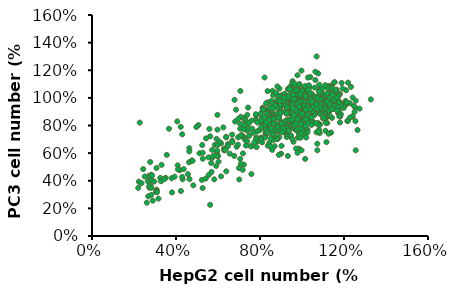
| Category | PC3 |
|---|---|
| 0.9039794408535161 | 0.946 |
| 0.8946343742699167 | 0.918 |
| 0.9824780001557512 | 0.901 |
| 0.9401136983101005 | 0.904 |
| 0.5625730083326844 | 0.722 |
| 0.9581808270383927 | 0.885 |
| 0.8634841523245853 | 0.888 |
| 0.835448952573787 | 0.912 |
| 0.8535160813020792 | 0.978 |
| 0.8123977883342419 | 0.929 |
| 0.9905770578615373 | 0.923 |
| 0.9961840978116969 | 0.904 |
| 0.9631648625496456 | 0.909 |
| 1.0049061599563898 | 0.913 |
| 1.0136282221010824 | 0.896 |
| 0.9301456272875944 | 0.925 |
| 0.920800560703995 | 0.94 |
| 0.9183085429483685 | 0.975 |
| 0.9457207382602602 | 0.93 |
| 0.9232925784596215 | 0.901 |
| 0.9550658048438595 | 0.901 |
| 0.9345066583599408 | 0.891 |
| 0.854139085740986 | 0.905 |
| 0.9251615917763414 | 0.951 |
| 0.9706409158165252 | 1.059 |
| 0.9999221244451366 | 1.015 |
| 1.017989253173429 | 0.996 |
| 1.0615995638968927 | 0.992 |
| 0.9787399735223113 | 0.908 |
| 0.9799859824001246 | 0.961 |
| 0.9519507826493264 | 0.933 |
| 0.9494587648936998 | 0.985 |
| 1.087765750330971 | 0.997 |
| 0.952573787088233 | 0.98 |
| 0.9787399735223113 | 0.955 |
| 0.9295226228486878 | 0.964 |
| 0.7432442956156062 | 0.93 |
| 0.9494587648936998 | 0.908 |
| 0.9002414142200763 | 0.904 |
| 0.89401136983101 | 0.956 |
| 0.9656568803052722 | 1.059 |
| 0.984347013472471 | 1 |
| 0.9544428004049529 | 1.031 |
| 0.5625730083326844 | 0.225 |
| 0.964410871427459 | 0.974 |
| 0.967525893621992 | 0.973 |
| 0.9718869246943385 | 0.964 |
| 1.0435324351686006 | 0.991 |
| 0.952573787088233 | 1.094 |
| 0.9706409158165252 | 0.999 |
| 1.05474651506892 | 0.985 |
| 0.9650338758663656 | 0.94 |
| 0.9880850401059108 | 0.964 |
| 0.9338836539210342 | 0.939 |
| 1.0005451288840432 | 0.956 |
| 0.9656568803052722 | 1.001 |
| 1.0005451288840432 | 1.06 |
| 0.8136437972120552 | 0.918 |
| 1.0348103730239078 | 0.932 |
| 0.9806089868390312 | 1.027 |
| 0.9612958492329258 | 0.927 |
| 0.9151935207538354 | 0.986 |
| 0.9831010045946578 | 1.005 |
| 0.9936920800560703 | 1.038 |
| 0.9974301066895102 | 1.039 |
| 1.006152168834203 | 0.929 |
| 0.9232925784596215 | 0.903 |
| 0.8915193520753836 | 0.85 |
| 0.9669028891830854 | 0.888 |
| 0.9905770578615373 | 0.942 |
| 0.8391869792072268 | 0.896 |
| 0.9799859824001246 | 0.974 |
| 0.9961840978116969 | 0.996 |
| 1.0921267814033175 | 0.938 |
| 0.8366949614516004 | 0.967 |
| 0.6815668561638502 | 0.829 |
| 0.9774939646444981 | 0.846 |
| 0.9812319912779378 | 0.877 |
| 1.006152168834203 | 0.965 |
| 1.0098901954676427 | 1.001 |
| 1.2079282918823382 | 0.978 |
| 1.1756091402600681 | 0.944 |
| 1.117030677944704 | 0.873 |
| 1.0493624542355764 | 0.813 |
| 0.9261456886756723 | 0.804 |
| 0.9897740184320162 | 0.954 |
| 1.0029036737785633 | 0.827 |
| 1.0655220300467112 | 0.929 |
| 1.1291503598030552 | 0.908 |
| 1.0443125867945966 | 0.936 |
| 0.9261456886756723 | 0.831 |
| 1.0332028784244414 | 0.859 |
| 0.9524049993687665 | 0.811 |
| 1.0362327988890292 | 0.859 |
| 1.0806716323696504 | 0.898 |
| 1.0604721626057316 | 0.982 |
| 1.0796616588814543 | 0.925 |
| 0.990783991920212 | 0.904 |
| 1.0140133821487185 | 0.846 |
| 0.991793965408408 | 0.748 |
| 0.36662037621512433 | 0.776 |
| 0.22724403484408534 | 0.821 |
| 0.977654336573665 | 0.927 |
| 0.9877540714556243 | 0.982 |
| 1.0907713672516097 | 1.001 |
| 1.0039136472667594 | 0.915 |
| 0.9857341244792324 | 0.892 |
| 0.9231157682110844 | 0.802 |
| 0.8049488700921601 | 0.837 |
| 0.8938265370534023 | 0.925 |
| 0.8918065900770105 | 0.93 |
| 0.9897740184320162 | 1.05 |
| 1.0220931700542861 | 1.002 |
| 1.023103143542482 | 0.932 |
| 1.038252745865421 | 0.857 |
| 0.8736270672894837 | 0.857 |
| 0.8928165635652064 | 0.946 |
| 0.9019063249589698 | 0.818 |
| 0.9564448933215504 | 0.89 |
| 0.9857341244792324 | 0.86 |
| 0.9705845221562934 | 0.846 |
| 1.007953541219543 | 0.895 |
| 1.0099734881959348 | 0.854 |
| 1.0261330640070698 | 0.769 |
| 0.9665446282035096 | 0.773 |
| 0.883726802171443 | 0.754 |
| 0.8776669612422674 | 0.813 |
| 0.9332155030930438 | 0.838 |
| 0.898876404494382 | 0.963 |
| 0.8726170938012877 | 0.867 |
| 0.9998737533139755 | 0.818 |
| 0.7140512561545259 | 0.729 |
| 0.7393005933594243 | 0.877 |
| 0.7817194798636535 | 0.873 |
| 0.4060093422547658 | 0.83 |
| 1.0029036737785633 | 0.816 |
| 0.9372553970458275 | 0.937 |
| 0.9574548668097462 | 0.839 |
| 0.9291756091402601 | 0.749 |
| 0.8978664310061861 | 0.796 |
| 0.7241509910364853 | 0.854 |
| 0.7090013887135462 | 0.863 |
| 0.7776795859108698 | 0.842 |
| 0.8140386314859235 | 0.919 |
| 0.6787021840676682 | 0.986 |
| 1.0463325337709886 | 0.836 |
| 0.9271556621638682 | 0.716 |
| 1.0261330640070698 | 0.751 |
| 0.7978790556747886 | 0.765 |
| 0.8796869082186592 | 0.882 |
| 0.8968564575179901 | 0.949 |
| 0.9968438328493877 | 0.94 |
| 1.0200732230778942 | 0.853 |
| 0.9897740184320162 | 0.867 |
| 1.0180532761015024 | 0.784 |
| 1.0513824012119681 | 0.961 |
| 0.8594874384547405 | 1.051 |
| 0.9322055296048479 | 1.064 |
| 0.9251357151874763 | 0.966 |
| 0.9049362454235577 | 1.02 |
| 1.1807157645666961 | 0.822 |
| 1.1594202898550725 | 0.967 |
| 1.2162082224194026 | 0.833 |
| 1.1428571428571428 | 0.855 |
| 1.2185743862762497 | 0.833 |
| 1.2079266489204377 | 0.954 |
| 1.162969535640343 | 0.978 |
| 1.05175983436853 | 1.02 |
| 0.9653948535936113 | 0.95 |
| 1.0588583259390714 | 0.942 |
| 1.1144631765749777 | 0.884 |
| 1.1724341910677314 | 0.89 |
| 1.1511387163561078 | 0.964 |
| 1.2398698609878733 | 0.863 |
| 1.132209405501331 | 0.906 |
| 1.274179236912156 | 0.922 |
| 1.1227447500739427 | 0.985 |
| 0.9997042295178941 | 0.782 |
| 1.2079266489204377 | 0.95 |
| 1.18189884649512 | 0.865 |
| 1.1854480922803905 | 0.881 |
| 1.1416740609287193 | 0.978 |
| 1.2410529429162969 | 1.002 |
| 1.2114758947057083 | 0.967 |
| 1.0482105885832593 | 1.026 |
| 1.1144631765749777 | 0.972 |
| 1.129843241644484 | 0.996 |
| 1.1156462585034013 | 0.998 |
| 1.1333924874297545 | 1.023 |
| 1.228039041703638 | 0.961 |
| 1.2102928127772847 | 1.055 |
| 1.1404909790002957 | 1.089 |
| 1.0434782608695652 | 0.863 |
| 1.062407571724342 | 0.945 |
| 1.090801538006507 | 0.945 |
| 1.0434782608695652 | 0.948 |
| 1.054125998225377 | 0.996 |
| 1.0659568175096126 | 0.918 |
| 1.1724341910677314 | 1.01 |
| 1.1807157645666961 | 1.028 |
| 0.9677610174504584 | 0.938 |
| 1.0919846199349306 | 0.999 |
| 1.093167701863354 | 0.983 |
| 1.0553090801538008 | 0.959 |
| 1.064773735581189 | 0.932 |
| 1.1286601597160604 | 1.086 |
| 1.10854776693286 | 0.98 |
| 1.132209405501331 | 1.038 |
| 1.0422951789411417 | 0.911 |
| 1.0919846199349306 | 0.913 |
| 1.093167701863354 | 0.94 |
| 1.0553090801538008 | 0.905 |
| 1.064773735581189 | 0.926 |
| 1.1286601597160604 | 0.908 |
| 1.10854776693286 | 0.951 |
| 1.132209405501331 | 0.871 |
| 1.0280981958000592 | 0.994 |
| 1.0221827861579413 | 1.05 |
| 1.0860692102928127 | 1.044 |
| 1.0162673765158237 | 0.972 |
| 1.1535048802129548 | 1.02 |
| 1.0150842945874001 | 1.086 |
| 1.1771665187814255 | 1.03 |
| 1.0695060632948832 | 1.3 |
| 0.9523809523809523 | 1.087 |
| 0.9381839692398699 | 0.998 |
| 1.0493936705116829 | 0.93 |
| 0.9204377403135167 | 0.898 |
| 0.9985211475894705 | 1.023 |
| 1.0446613427979887 | 1.006 |
| 1.0328305235137534 | 0.983 |
| 1.0020703933747412 | 1.054 |
| 0.8624667258207631 | 1.018 |
| 0.9026915113871635 | 0.975 |
| 1.0056196391600118 | 0.924 |
| 0.9204377403135167 | 0.986 |
| 0.8080449571132801 | 0.82 |
| 0.8967761017450459 | 1.015 |
| 0.9168884945282461 | 1.03 |
| 0.9582963620230701 | 1.063 |
| 1.1316025067144135 | 1.028 |
| 1.1683079677708146 | 0.906 |
| 0.9659803043867502 | 0.943 |
| 1.1199641897940913 | 0.818 |
| 1.1190689346463742 | 0.861 |
| 0.9865711727842436 | 1.014 |
| 1.1056401074306177 | 1.021 |
| 1.0564010743061774 | 0.951 |
| 0.9883616830796778 | 1.097 |
| 0.8845120859444942 | 1.019 |
| 1.0590868397493285 | 0.875 |
| 1.1772605192479857 | 0.867 |
| 1.0662488809310653 | 0.935 |
| 1.188898836168308 | 1.108 |
| 1.2193375111906894 | 1.11 |
| 1.153088630259624 | 1.11 |
| 1.091316025067144 | 1.043 |
| 1.098478066248881 | 1.01 |
| 1.1181736794986572 | 1.084 |
| 1.054610564010743 | 0.98 |
| 0.954341987466428 | 0.968 |
| 1.0295434198746642 | 0.977 |
| 1.0957923008057295 | 0.964 |
| 1.0823634735899732 | 1.096 |
| 1.0948970456580125 | 1.018 |
| 1.1208594449418083 | 0.951 |
| 1.0769919427036705 | 1.177 |
| 1.107430617726052 | 0.929 |
| 1.1772605192479857 | 0.975 |
| 1.0841539838854073 | 1.025 |
| 1.0599820948970458 | 1.075 |
| 1.198746642793196 | 0.926 |
| 0.9534467323187108 | 1.049 |
| 0.9435989256938228 | 1.023 |
| 1.035810205908684 | 1.076 |
| 1.1280214861235451 | 0.971 |
| 1.08952551477171 | 1.048 |
| 1.0832587287376902 | 0.915 |
| 1.3276633840644583 | 0.989 |
| 1.1119068934646374 | 0.924 |
| 0.7000895255147717 | 0.492 |
| 0.964189794091316 | 0.93 |
| 0.9785138764547896 | 1.164 |
| 0.9838854073410922 | 1.035 |
| 1.1101163831692031 | 0.986 |
| 1.143240823634736 | 1.038 |
| 1.0635631154879142 | 1.189 |
| 1.037600716204118 | 0.966 |
| 0.981199641897941 | 0.929 |
| 1.0787824529991048 | 0.963 |
| 0.955237242614145 | 1.121 |
| 1.0313339301700986 | 1.023 |
| 1.099373321396598 | 0.944 |
| 0.9776186213070726 | 1.051 |
| 1.1933751119068934 | 1.068 |
| 0.9650850492390332 | 0.959 |
| 0.9077887197851388 | 0.776 |
| 0.8683974932855864 | 0.955 |
| 0.9534467323187108 | 0.993 |
| 1.0689346463742166 | 0.75 |
| 0.42256042972247093 | 0.79 |
| 0.9704565801253358 | 0.986 |
| 1.0975828111011638 | 1.028 |
| 0.9507609668755596 | 0.884 |
| 0.9382273948075202 | 0.934 |
| 0.9534467323187108 | 0.939 |
| 0.927484333034915 | 1.012 |
| 0.9570277529095792 | 0.936 |
| 0.9829901521933752 | 1.09 |
| 0.982094897045658 | 1.039 |
| 1.0635631154879142 | 1.129 |
| 0.9973142345568488 | 1.197 |
| 0.9489704565801254 | 0.835 |
| 0.8925693822739481 | 1.067 |
| 0.8889883616830797 | 0.981 |
| 0.9140555058191585 | 1.003 |
| 0.8809310653536258 | 0.985 |
| 0.88272157564906 | 1.083 |
| 0.9319606087735004 | 1.008 |
| 0.9606087735004476 | 1.021 |
| 1.0196207749381698 | 0.876 |
| 1.2530915086562242 | 0.93 |
| 1.1686727122835945 | 0.945 |
| 1.0842539159109645 | 0.745 |
| 1.085572959604287 | 0.808 |
| 1.0499587798845837 | 0.97 |
| 1.085572959604287 | 0.939 |
| 1.2412201154163232 | 0.867 |
| 1.1845012366034624 | 0.939 |
| 1.133058532563891 | 1.002 |
| 0.9193734542456719 | 0.762 |
| 1.1000824402308327 | 0.851 |
| 1.1119538334707337 | 0.866 |
| 1.0618301731244848 | 0.935 |
| 0.3073371805441055 | 0.336 |
| 1.113272877164056 | 1.017 |
| 1.0394064303380048 | 0.98 |
| 1.0328112118713932 | 0.964 |
| 1.0697444352844188 | 0.96 |
| 1.0921681780708985 | 0.91 |
| 0.8916735366859028 | 0.917 |
| 0.8468260511129431 | 0.918 |
| 1.047320692497939 | 0.986 |
| 1.0908491343775764 | 0.995 |
| 1.2333058532563892 | 1.08 |
| 0.35614179719703215 | 0.587 |
| 1.1198680956306677 | 0.967 |
| 1.1502061005770816 | 0.92 |
| 1.1502061005770816 | 1.027 |
| 1.0921681780708985 | 1.04 |
| 1.0842539159109645 | 0.891 |
| 1.247815333882935 | 0.941 |
| 1.1647155812036274 | 1.06 |
| 0.9906018136850783 | 0.928 |
| 1.1462489694971145 | 1.023 |
| 1.0763396537510306 | 0.818 |
| 1.1040395713107998 | 0.853 |
| 0.9444352844187964 | 0.933 |
| 1.109315746084089 | 0.885 |
| 1.2504534212695795 | 0.899 |
| 1.0394064303380048 | 1.151 |
| 0.9417971970321517 | 1.078 |
| 1.1765869744435284 | 0.901 |
| 1.105358615004122 | 0.87 |
| 1.1383347073371806 | 1.072 |
| 1.005111294311624 | 0.788 |
| 0.8441879637262985 | 0.928 |
| 1.255729596042869 | 0.98 |
| 1.0816158285243198 | 1.06 |
| 0.9866446826051113 | 1.032 |
| 1.133058532563891 | 0.937 |
| 0.9774113767518549 | 0.815 |
| 1.1079967023907666 | 0.953 |
| 1.085572959604287 | 0.885 |
| 1.1119538334707337 | 0.762 |
| 1.055234954657873 | 0.823 |
| 1.0328112118713932 | 1.091 |
| 1.005111294311624 | 1.044 |
| 1.1462489694971145 | 1.067 |
| 1.1145919208573785 | 0.982 |
| 1.0618301731244848 | 0.915 |
| 1.0750206100577082 | 0.908 |
| 1.0987633965375103 | 0.873 |
| 1.1277823577906019 | 0.908 |
| 0.8362737015663644 | 1.049 |
| 1.0367683429513603 | 1.039 |
| 1.1607584501236603 | 1.057 |
| 1.1106347897774114 | 0.979 |
| 1.1356966199505358 | 0.963 |
| 0.9840065952184666 | 0.936 |
| 1.213520197856554 | 0.968 |
| 0.9866446826051113 | 1.099 |
| 0.9774113767518549 | 0.898 |
| 0.9906018136850783 | 0.972 |
| 0.9747732893652102 | 1.056 |
| 1.0103874690849135 | 0.943 |
| 1.1198680956306677 | 1.072 |
| 1.0130255564715582 | 1.013 |
| 1.089530090684254 | 0.954 |
| 0.8217642209398186 | 1.148 |
| 0.5692108667529108 | 0.464 |
| 0.3081788127066264 | 0.328 |
| 0.2230846629294236 | 0.393 |
| 1.0728762397585165 | 0.621 |
| 0.9854822480954435 | 0.632 |
| 1.0728762397585165 | 0.668 |
| 0.9716831967802214 | 0.633 |
| 1.061377030329165 | 1.007 |
| 0.5703607876958459 | 0.564 |
| 0.265631737818025 | 0.397 |
| 0.7233002731062239 | 0.516 |
| 0.9325858847204255 | 0.579 |
| 1.1165732355900533 | 0.68 |
| 0.9785827224378324 | 0.757 |
| 1.254563748742274 | 0.831 |
| 1.1384217335058215 | 0.749 |
| 0.2702314215897657 | 0.434 |
| 0.6359062814431508 | 0.635 |
| 1.002731062239471 | 0.758 |
| 0.9797326433807676 | 0.712 |
| 1.1269225240764698 | 0.74 |
| 0.9475348569785828 | 0.728 |
| 0.969383354894351 | 0.772 |
| 1.015380192611758 | 0.73 |
| 1.0774759235302573 | 1.015 |
| 0.9003880983182406 | 0.596 |
| 0.6025585740980307 | 0.538 |
| 0.2794307891332471 | 0.365 |
| 0.9785827224378324 | 0.603 |
| 0.8451918930573523 | 0.677 |
| 0.2736811844185712 | 0.349 |
| 0.8256432370274543 | 0.749 |
| 0.7244501940491591 | 0.714 |
| 0.9716831967802214 | 0.806 |
| 0.25068276555986774 | 0.43 |
| 0.9854822480954435 | 0.727 |
| 0.7175506683915481 | 0.479 |
| 1.0199798763834986 | 0.713 |
| 0.6255569929567342 | 0.786 |
| 1.2557136696852091 | 0.621 |
| 0.3311772315653299 | 0.515 |
| 0.9831824062095731 | 0.772 |
| 0.9590340664079344 | 0.931 |
| 0.7589478223372144 | 0.448 |
| 1.082075607301998 | 0.802 |
| 1.141871496334627 | 0.919 |
| 1.0809256863590628 | 0.768 |
| 1.0567773465574242 | 0.892 |
| 0.7278999568779646 | 0.836 |
| 0.8923386517176944 | 0.717 |
| 0.9383354894351014 | 0.764 |
| 0.27713094724737675 | 0.536 |
| 0.737099324421446 | 0.807 |
| 0.8612907862584447 | 0.836 |
| 0.9590340664079344 | 0.836 |
| 1.0211297973264337 | 0.848 |
| 0.9544343826361937 | 1.109 |
| 1.108523788989507 | 0.848 |
| 1.0786258444731924 | 0.757 |
| 0.9935316946959897 | 0.712 |
| 0.28173063101911744 | 0.443 |
| 0.28633031479085813 | 0.438 |
| 0.41857122322840307 | 0.477 |
| 1.0165301135546931 | 0.798 |
| 1.0199798763834986 | 1.016 |
| 0.9509846198073882 | 0.827 |
| 1.1062239471036366 | 0.924 |
| 0.9130372286905275 | 0.79 |
| 0.9486847779215178 | 0.838 |
| 0.677303435388817 | 0.579 |
| 0.9268362800057496 | 0.836 |
| 1.1142733937041829 | 0.974 |
| 0.24378323990225673 | 0.484 |
| 0.8371424464568061 | 0.654 |
| 0.8474917349432226 | 0.78 |
| 0.9509846198073882 | 0.859 |
| 0.9808825643237028 | 0.916 |
| 0.9268362800057496 | 0.758 |
| 1.0441282161851373 | 0.824 |
| 1.1832686502802932 | 0.964 |
| 0.7289386612369559 | 0.696 |
| 0.8307457368287096 | 0.798 |
| 0.9244082463731229 | 0.739 |
| 0.48256553830491217 | 0.367 |
| 1.0302876049885468 | 0.823 |
| 0.9753117841689998 | 0.772 |
| 0.9488419445151438 | 0.806 |
| 0.9223721048612878 | 0.947 |
| 0.8897938406719267 | 0.587 |
| 0.6393484347162128 | 0.468 |
| 0.8307457368287096 | 0.846 |
| 0.9936370577755154 | 0.778 |
| 0.7900229065920081 | 0.691 |
| 0.8063120386866888 | 0.714 |
| 0.46220412318656146 | 0.534 |
| 0.8816492746245864 | 0.926 |
| 0.8673962840417409 | 0.72 |
| 0.7187579536777806 | 0.598 |
| 0.9732756426571647 | 0.88 |
| 0.9325528124204632 | 0.767 |
| 0.9977093407991855 | 0.62 |
| 0.4235174344616951 | 0.325 |
| 1.1565283787223213 | 0.942 |
| 0.9773479256808348 | 0.955 |
| 0.8592517179944006 | 0.734 |
| 1.0038177653346907 | 0.822 |
| 1.0282514634767117 | 0.91 |
| 0.8836854161364215 | 0.703 |
| 0.9936370577755154 | 0.743 |
| 1.1137694069737847 | 0.819 |
| 1.1341308220921353 | 0.952 |
| 0.506999236446933 | 0.803 |
| 1.26444387884958 | 0.767 |
| 1.2277933316365488 | 0.858 |
| 1.1035886994146094 | 0.855 |
| 0.8959022652074319 | 0.768 |
| 0.9977093407991855 | 0.83 |
| 0.9060829727666073 | 0.823 |
| 1.0058539068465258 | 0.911 |
| 0.8755408500890812 | 1.037 |
| 0.8185288877576992 | 0.815 |
| 0.8327818783405446 | 0.886 |
| 0.8429625858997201 | 0.866 |
| 0.9142275388139476 | 0.752 |
| 1.1850343598880122 | 0.94 |
| 1.093407991855434 | 0.991 |
| 1.0750827182489182 | 0.999 |
| 0.9427335199796386 | 1.062 |
| 0.6474930007635531 | 0.666 |
| 0.43166200050903536 | 0.411 |
| 0.928480529396793 | 0.93 |
| 0.4296258589972003 | 0.428 |
| 0.8612878595062357 | 0.816 |
| 1.0811911427844234 | 0.987 |
| 1.1198778315092899 | 1.033 |
| 0.9651310766098243 | 1.102 |
| 0.8633240010180707 | 0.75 |
| 0.7839144820565029 | 0.684 |
| 0.954950369050649 | 0.79 |
| 0.7879867650801731 | 0.687 |
| 0.5721557648256553 | 0.623 |
| 0.8816492746245864 | 0.703 |
| 1.089335708831764 | 0.92 |
| 1.0282514634767117 | 1.147 |
| 0.8388903028760499 | 0.818 |
| 0.6678544158819038 | 0.69 |
| 0.5232883685416136 | 0.406 |
| 1.036396029524052 | 0.906 |
| 0.5558666327309748 | 0.442 |
| 0.4642402646983965 | 0.412 |
| 0.6149147365741919 | 0.671 |
| 1.0078900483583608 | 1.031 |
| 0.7798421990328328 | 0.882 |
| 0.8327818783405446 | 0.843 |
| 0.8673962840417409 | 0.944 |
| 0.8266734538050394 | 0.768 |
| 0.8185288877576992 | 0.836 |
| 0.8327818783405446 | 0.807 |
| 0.8083481801985238 | 0.856 |
| 0.7065411046067702 | 1.05 |
| 0.4633755123863839 | 0.636 |
| 0.7057565496346462 | 0.777 |
| 0.5845660310105151 | 0.659 |
| 0.5432186775975761 | 0.707 |
| 0.6287649260381394 | 0.632 |
| 0.7841739440384958 | 0.644 |
| 0.8283728390661201 | 0.81 |
| 0.9224737123507396 | 0.835 |
| 0.554624844056318 | 0.569 |
| 0.3792550347531634 | 0.418 |
| 0.4747816788451256 | 0.547 |
| 0.85973979682766 | 0.735 |
| 0.26804491178043127 | 0.287 |
| 0.38068080556050615 | 0.316 |
| 0.35073961860630903 | 0.422 |
| 0.3250757440741401 | 0.42 |
| 0.4633755123863839 | 0.612 |
| 0.8169666726073783 | 0.794 |
| 0.7385492782035288 | 0.685 |
| 0.8283728390661201 | 0.735 |
| 0.9595437533416503 | 0.682 |
| 1.0151488148280163 | 0.558 |
| 0.2837283906612012 | 0.404 |
| 0.7299946533594724 | 0.843 |
| 0.2965603279272857 | 0.395 |
| 0.6886472999465336 | 0.646 |
| 0.2823026198538585 | 0.298 |
| 0.5275351987168063 | 0.559 |
| 0.7485296738549279 | 0.725 |
| 0.2894314738905721 | 0.256 |
| 0.5760114061664587 | 0.578 |
| 0.8711459632864017 | 0.769 |
| 0.8583140260203173 | 0.623 |
| 0.8896809837818571 | 0.765 |
| 0.7599358403136696 | 0.649 |
| 0.7556585278916415 | 0.65 |
| 0.2609160577437177 | 0.241 |
| 0.8240955266440919 | 0.712 |
| 0.5988237390839423 | 0.659 |
| 0.8925325253965425 | 0.769 |
| 0.5973979682765995 | 0.77 |
| 0.5118517198360364 | 0.599 |
| 0.600249509891285 | 0.578 |
| 0.27232222420245944 | 0.361 |
| 0.6145072179647122 | 0.432 |
| 0.8041347353412939 | 0.703 |
| 0.8198182142220638 | 0.839 |
| 0.6672607378363928 | 0.734 |
| 0.40777045090001784 | 0.512 |
| 0.31652111923008375 | 0.271 |
| 0.5916948850472287 | 0.507 |
| 0.9025129210479416 | 0.653 |
| 0.9524148993049367 | 0.705 |
| 0.8098378185706647 | 0.677 |
| 0.7328461949741579 | 0.655 |
| 0.69720192479059 | 0.849 |
| 0.6472999465335947 | 0.65 |
| 0.869720192479059 | 0.65 |
| 0.8640171092496881 | 0.696 |
| 0.4790589912671538 | 0.544 |
| 0.85973979682766 | 0.814 |
| 0.941008732846195 | 0.836 |
| 0.8625913384423454 | 0.814 |
| 0.5589021564783461 | 0.776 |
| 0.9367314204241668 | 0.889 |
| 0.7128854036713598 | 0.72 |
| 0.7827481732311531 | 0.715 |
| 0.6957761539832472 | 0.715 |
| 0.5945464266619142 | 0.603 |
| 0.655854571377651 | 0.596 |
| 0.6073783639279986 | 0.682 |
| 0.6387453216895385 | 0.718 |
| 0.9880591694885047 | 0.931 |
| 0.8055605061486366 | 0.834 |
| 0.7014792372126181 | 0.409 |
| 0.9267510247727678 | 0.781 |
| 0.8511851719836037 | 0.707 |
| 0.40919622170736053 | 0.482 |
| 0.305114952771342 | 0.319 |
| 0.6686865086437355 | 0.679 |
| 0.9606003752345216 | 0.975 |
| 0.8585365853658536 | 0.958 |
| 0.6859287054409006 | 0.914 |
| 0.8285178236397749 | 0.961 |
| 0.8210131332082552 | 0.859 |
| 0.49681050656660414 | 0.789 |
| 0.9711069418386492 | 0.892 |
| 0.8420262664165103 | 0.844 |
| 0.5928705440900562 | 0.581 |
| 0.7804878048780488 | 0.699 |
| 0.8915572232645403 | 0.871 |
| 0.9545966228893058 | 0.953 |
| 0.8945590994371482 | 0.793 |
| 1.1121951219512196 | 0.965 |
| 1.1722326454033771 | 1.017 |
| 0.9095684803001877 | 0.979 |
| 1.0731707317073171 | 0.998 |
| 1.0851782363977487 | 0.932 |
| 0.3091932457786116 | 0.317 |
| 1.0446529080675422 | 0.804 |
| 0.526829268292683 | 0.347 |
| 1.176735459662289 | 0.966 |
| 1.1692307692307693 | 0.933 |
| 1.0011257035647279 | 1.052 |
| 0.8195121951219512 | 0.92 |
| 0.8930581613508443 | 0.977 |
| 0.9530956848030019 | 0.83 |
| 1.152720450281426 | 0.984 |
| 1.1196998123827393 | 0.973 |
| 1.0551594746716697 | 0.939 |
| 0.2821763602251407 | 0.348 |
| 0.32870544090056286 | 0.396 |
| 0.5928705440900562 | 0.703 |
| 0.5973733583489681 | 0.877 |
| 0.9846153846153847 | 0.924 |
| 0.8045028142589118 | 0.889 |
| 1.0296435272045028 | 1.06 |
| 1.09718574108818 | 1.067 |
| 0.8150093808630394 | 0.914 |
| 1.1106941838649156 | 1.092 |
| 0.5823639774859287 | 0.41 |
| 0.3932457786116323 | 0.43 |
| 0.7819887429643527 | 0.837 |
| 0.7594746716697937 | 0.836 |
| 0.9305816135084428 | 0.754 |
| 0.9801125703564728 | 0.841 |
| 0.9621013133208255 | 0.848 |
| 1.1557223264540337 | 1.114 |
| 0.8720450281425891 | 0.943 |
| 0.7399624765478424 | 0.761 |
| 0.9696060037523452 | 0.859 |
| 0.9816135084427767 | 0.847 |
| 0.7459662288930582 | 0.778 |
| 1.0146341463414634 | 0.851 |
| 1.0671669793621013 | 0.954 |
| 1.050656660412758 | 0.975 |
| 1.0131332082551594 | 0.914 |
| 1.0431519699812384 | 0.991 |
| 0.9110694183864916 | 0.815 |
| 1.1662288930581612 | 0.909 |
| 1.04765478424015 | 0.975 |
| 1.0716697936210131 | 0.918 |
| 1.049155722326454 | 0.904 |
| 0.9861163227016886 | 0.935 |
| 0.8600375234521576 | 0.867 |
| 1.0281425891181988 | 0.94 |
| 1.0296435272045028 | 0.882 |
| 0.9500938086303939 | 0.896 |
| 0.974108818011257 | 0.867 |
| 0.9575984990619137 | 0.803 |
| 1.0371482176360225 | 0.904 |
| 1.1662288930581612 | 1.002 |
| 0.8615384615384616 | 0.86 |
| 0.9696060037523452 | 0.856 |
| 0.8045028142589118 | 0.701 |
| 1.0686679174484053 | 0.815 |
| 1.0191369606003753 | 1.001 |
| 0.9305816135084428 | 0.76 |
| 1.0446529080675422 | 0.859 |
| 1.025140712945591 | 0.932 |
| 0.4367747694138649 | 0.484 |
| 0.8580779529901815 | 0.923 |
| 0.9949419815531092 | 0.812 |
| 0.9116334424278488 | 0.777 |
| 0.906872954477834 | 0.752 |
| 0.8307051472775959 | 0.743 |
| 0.8783100267777447 | 0.793 |
| 0.8211841713775662 | 0.802 |
| 0.4296340374888426 | 0.736 |
| 0.3439452543885748 | 0.412 |
| 0.8426063671526332 | 0.812 |
| 0.7057423385897055 | 0.558 |
| 0.936626004165427 | 0.763 |
| 0.8616483189526927 | 0.854 |
| 0.22017256768818805 | 0.349 |
| 0.2356441535257364 | 0.382 |
| 0.6390955072894972 | 0.714 |
| 0.5962511157393633 | 0.619 |
| 0.7866706337399584 | 0.758 |
| 0.8485569770901518 | 0.648 |
| 0.8830705147277595 | 0.789 |
| 0.7093127045522166 | 0.73 |
| 0.890211246652782 | 0.873 |
| 0.9806605177030646 | 0.901 |
| 0.9818506396905683 | 1.023 |
| 0.6295745313894674 | 0.62 |
| 0.8556977090151741 | 0.763 |
| 0.7057423385897055 | 0.811 |
| 0.7628681939898839 | 0.777 |
| 0.7878607557274621 | 0.821 |
| 0.7378756322523059 | 0.824 |
| 0.9616185659030051 | 0.99 |
| 0.5248437964891401 | 0.659 |
| 0.7735792918774175 | 0.678 |
| 0.635525141326986 | 0.624 |
| 0.5272240404641476 | 0.603 |
| 0.8509372210651592 | 0.78 |
| 0.9961321035406129 | 0.874 |
| 0.9687592978280274 | 0.901 |
| 0.991371615590598 | 1.015 |
| 0.7093127045522166 | 0.523 |
| 0.6950312407021719 | 0.661 |
| 0.9651889318655162 | 0.799 |
| 0.9723296637905385 | 0.814 |
| 0.9033025885153229 | 0.812 |
| 0.999702469503124 | 0.886 |
| 0.9568580779529902 | 0.836 |
| 0.9330556382029158 | 0.888 |
| 0.7224040464147575 | 0.772 |
| 1.012793811365665 | 1.011 |
| 1.0211246652781911 | 0.846 |
| 0.8973519785778042 | 0.89 |
| 0.8652186849152038 | 0.848 |
| 1.037786373103243 | 0.917 |
| 0.567688188039274 | 0.528 |
| 0.9735197857780422 | 0.892 |
| 0.9544778339779827 | 0.895 |
| 0.8057125855400179 | 0.789 |
| 0.953287711990479 | 0.843 |
| 1.0187444213031835 | 0.914 |
| 0.9259149062778935 | 0.885 |
| 0.9271050282653972 | 0.888 |
| 0.7462064861648319 | 0.815 |
| 1.080630764653377 | 1.046 |
| 0.8890211246652782 | 0.859 |
| 0.9687592978280274 | 0.916 |
| 0.91520380839036 | 1.001 |
| 0.9782802737280571 | 0.845 |
| 0.7676286819398989 | 0.748 |
| 0.8354656352276109 | 0.748 |
| 0.8437964891401368 | 0.842 |
| 0.3070514727759595 | 0.492 |
| 0.9925617375781017 | 1.028 |
| 0.7259744123772687 | 0.802 |
| 0.8295150252900922 | 0.823 |
| 0.45700684320142815 | 0.448 |
| 0.9616185659030051 | 0.878 |
| 0.9556679559654865 | 0.927 |
| 0.5415055043141922 | 0.416 |
| 1.0163641773281762 | 1.012 |